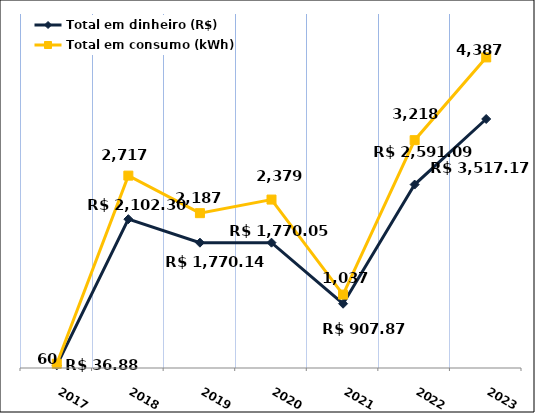
| Category | Total em dinheiro (R$) |
|---|---|
| 2017.0 | 36.88 |
| 2018.0 | 2102.3 |
| 2019.0 | 1770.14 |
| 2020.0 | 1770.05 |
| 2021.0 | 907.87 |
| 2022.0 | 2591.09 |
| 2023.0 | 3517.17 |